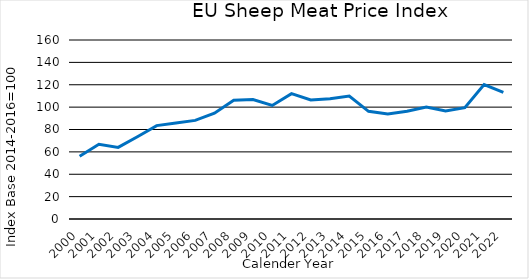
| Category | DE, ES, FR, IE, PT |
|---|---|
| 2000.0 | 56.089 |
| 2001.0 | 66.847 |
| 2002.0 | 63.99 |
| 2003.0 | 73.556 |
| 2004.0 | 83.487 |
| 2005.0 | 85.783 |
| 2006.0 | 88.16 |
| 2007.0 | 94.527 |
| 2008.0 | 106.185 |
| 2009.0 | 106.723 |
| 2010.0 | 101.534 |
| 2011.0 | 112.077 |
| 2012.0 | 106.46 |
| 2013.0 | 107.457 |
| 2014.0 | 109.911 |
| 2015.0 | 96.254 |
| 2016.0 | 93.834 |
| 2017.0 | 96.242 |
| 2018.0 | 100.126 |
| 2019.0 | 96.506 |
| 2020.0 | 99.564 |
| 2021.0 | 120.188 |
| 2022.0 | 113.269 |